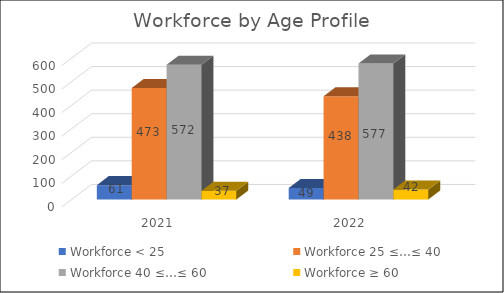
| Category | Workforce < 25 | Workforce 25 ≤…≤ 40 | Workforce 40 ≤…≤ 60 | Workforce ≥ 60 |
|---|---|---|---|---|
| 2021.0 | 61 | 473 | 572 | 37 |
| 2022.0 | 49 | 438 | 577 | 42 |